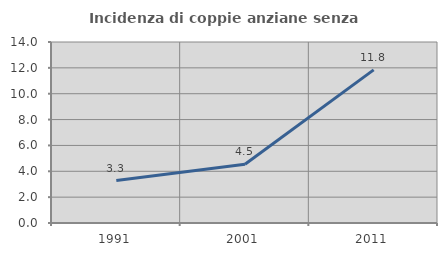
| Category | Incidenza di coppie anziane senza figli  |
|---|---|
| 1991.0 | 3.279 |
| 2001.0 | 4.545 |
| 2011.0 | 11.842 |